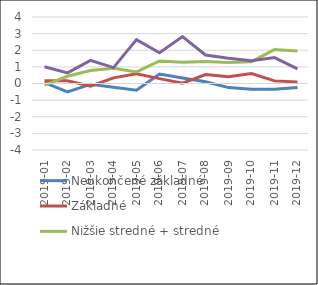
| Category | Neukončené základné | Základné | Nižšie stredné + stredné odborné | Úplné stredné odborné a vyššie |
|---|---|---|---|---|
| 2019-01 | 0.049 | 0.165 | -0.1 | 1.006 |
| 2019-02 | -0.507 | 0.161 | 0.434 | 0.636 |
| 2019-03 | -0.046 | -0.159 | 0.779 | 1.394 |
| 2019-04 | -0.224 | 0.34 | 0.917 | 0.957 |
| 2019-05 | -0.405 | 0.591 | 0.694 | 2.638 |
| 2019-06 | 0.571 | 0.294 | 1.354 | 1.847 |
| 2019-07 | 0.327 | 0.022 | 1.278 | 2.821 |
| 2019-08 | 0.104 | 0.538 | 1.316 | 1.714 |
| 2019-09 | -0.246 | 0.411 | 1.265 | 1.516 |
| 2019-10 | -0.348 | 0.603 | 1.314 | 1.362 |
| 2019-11 | -0.352 | 0.157 | 2.041 | 1.558 |
| 2019-12 | -0.239 | 0.092 | 1.954 | 0.877 |